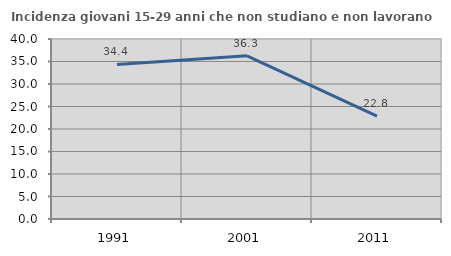
| Category | Incidenza giovani 15-29 anni che non studiano e non lavorano  |
|---|---|
| 1991.0 | 34.351 |
| 2001.0 | 36.259 |
| 2011.0 | 22.84 |